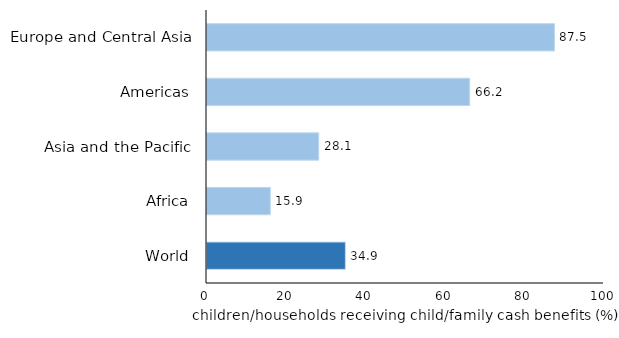
| Category | Series 0 |
|---|---|
| World | 34.858 |
| Africa | 15.94 |
| Asia and the Pacific | 28.144 |
| Americas | 66.158 |
| Europe and Central Asia | 87.524 |